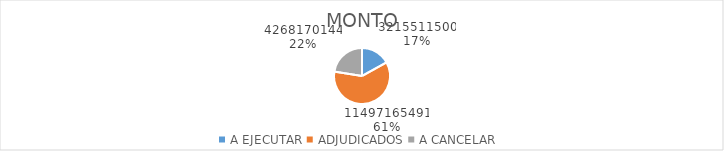
| Category | MONTO |
|---|---|
| A EJECUTAR | 3215511500 |
| ADJUDICADOS | 11497165491 |
| A CANCELAR | 4268170144 |